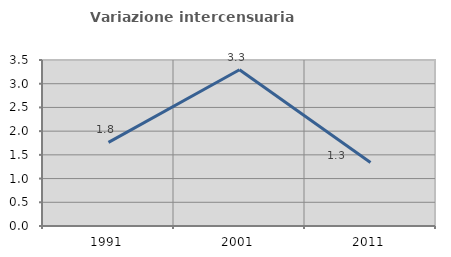
| Category | Variazione intercensuaria annua |
|---|---|
| 1991.0 | 1.762 |
| 2001.0 | 3.295 |
| 2011.0 | 1.337 |